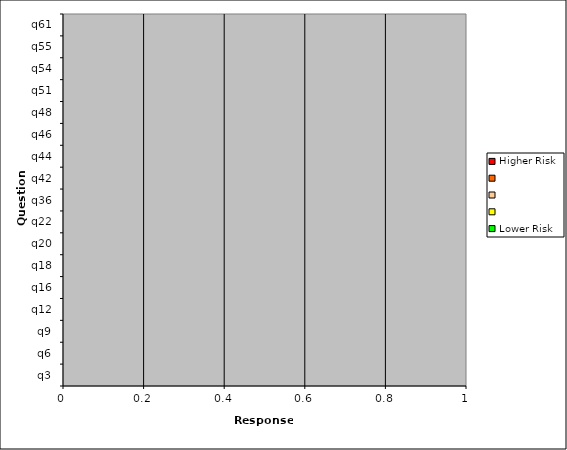
| Category | Higher Risk |   | Lower Risk |
|---|---|---|---|
| q3 | 0 | 0 | 0 |
| q6 | 0 | 0 | 0 |
| q9 | 0 | 0 | 0 |
| q12 | 0 | 0 | 0 |
| q16 | 0 | 0 | 0 |
| q18 | 0 | 0 | 0 |
| q20 | 0 | 0 | 0 |
| q22 | 0 | 0 | 0 |
| q36 | 0 | 0 | 0 |
| q42 | 0 | 0 | 0 |
| q44 | 0 | 0 | 0 |
| q46 | 0 | 0 | 0 |
| q48 | 0 | 0 | 0 |
| q51 | 0 | 0 | 0 |
| q54 | 0 | 0 | 0 |
| q55 | 0 | 0 | 0 |
| q61 | 0 | 0 | 0 |